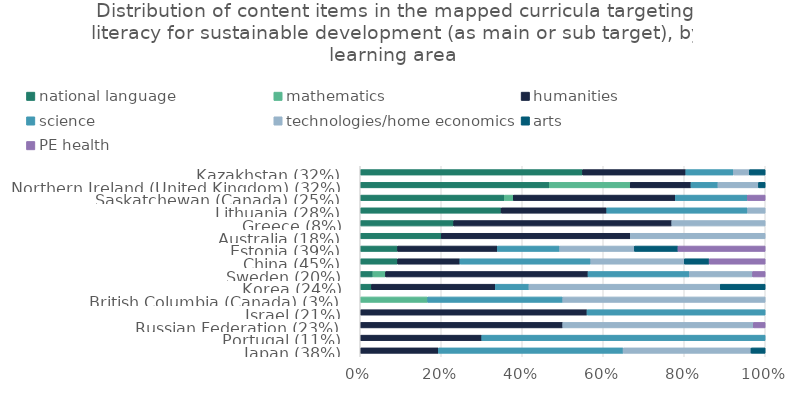
| Category | national language | mathematics | humanities | science | technologies/home economics | arts | PE health |
|---|---|---|---|---|---|---|---|
| Japan (38%) | 0 | 0 | 0.193 | 0.456 | 0.316 | 0.035 | 0 |
| Portugal (11%) | 0 | 0 | 0.3 | 0.7 | 0 | 0 | 0 |
| Russian Federation (23%) | 0 | 0 | 0.5 | 0 | 0.471 | 0 | 0.029 |
| Israel (21%) | 0 | 0 | 0.56 | 0.44 | 0 | 0 | 0 |
| British Columbia (Canada) (3%) | 0 | 0.167 | 0 | 0.333 | 0.5 | 0 | 0 |
| Korea (24%) | 0.028 | 0 | 0.306 | 0.083 | 0.472 | 0.111 | 0 |
| Sweden (20%) | 0.031 | 0.031 | 0.5 | 0.25 | 0.156 | 0 | 0.031 |
| China (45%) | 0.092 | 0 | 0.154 | 0.323 | 0.231 | 0.062 | 0.138 |
| Estonia (39%) | 0.092 | 0 | 0.246 | 0.154 | 0.185 | 0.108 | 0.215 |
| Australia (18%) | 0.2 | 0 | 0.467 | 0 | 0.333 | 0 | 0 |
| Greece (8%) | 0.231 | 0 | 0.538 | 0 | 0.231 | 0 | 0 |
| Lithuania (28%) | 0.348 | 0 | 0.261 | 0.348 | 0.043 | 0 | 0 |
| Saskatchewan (Canada) (25%) | 0.356 | 0.022 | 0.4 | 0.178 | 0 | 0 | 0.044 |
| Northern Ireland (United Kingdom) (32%) | 0.467 | 0.2 | 0.15 | 0.067 | 0.1 | 0.017 | 0 |
| Kazakhstan (32%) | 0.549 | 0 | 0.255 | 0.118 | 0.039 | 0.039 | 0 |